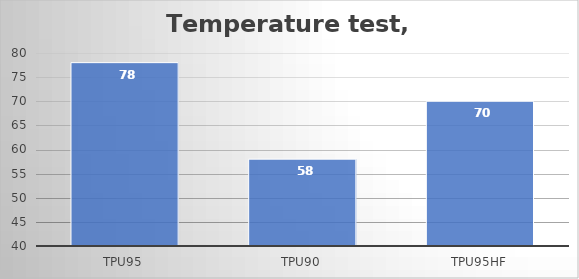
| Category | °C |
|---|---|
| TPU95 | 78 |
| TPU90 | 58 |
| TPU95HF | 70 |